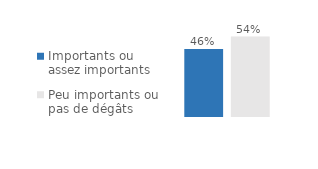
| Category | Importants ou assez importants | Peu importants ou pas de dégâts |
|---|---|---|
| 0 | 0.458 | 0.542 |